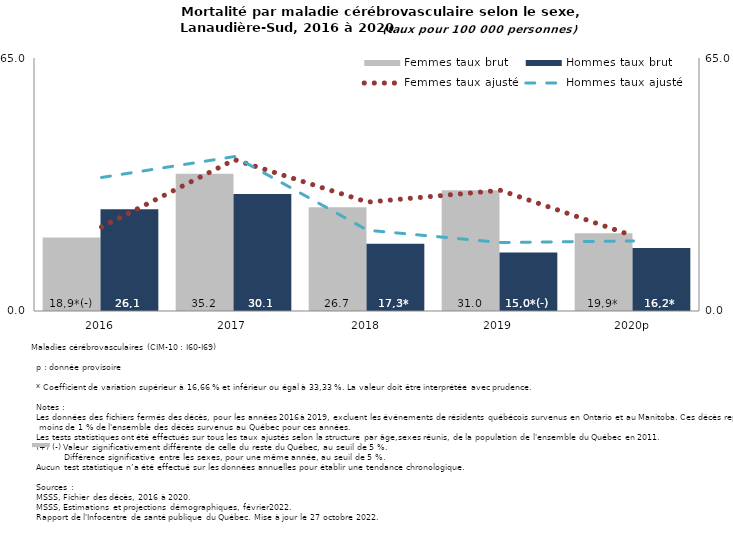
| Category | Femmes taux brut | Hommes taux brut |
|---|---|---|
| 2016 | 18.881 | 26.15 |
| 2017 | 35.236 | 30.083 |
| 2018 | 26.681 | 17.287 |
| 2019 | 31.027 | 15.021 |
| 2020p | 19.948 | 16.185 |